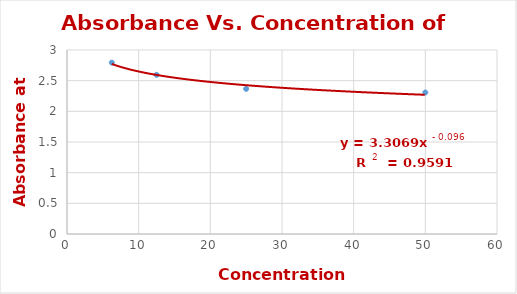
| Category | Series 0 |
|---|---|
| 50.0 | 2.307 |
| 25.0 | 2.367 |
| 12.5 | 2.596 |
| 6.25 | 2.794 |